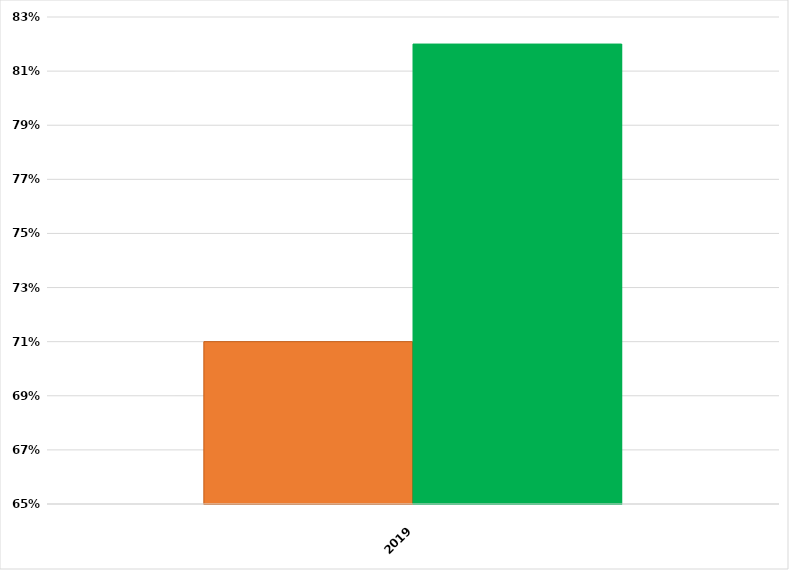
| Category | VALOR  | META PONDERADA |
|---|---|---|
| 2019.0 | 0.71 | 0.82 |